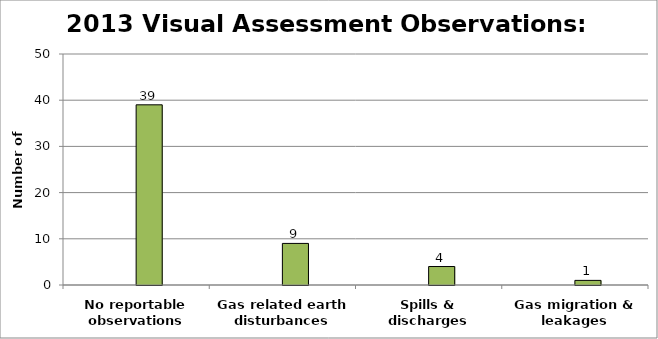
| Category | Series 0 | Series 1 | Series 2 | Series 3 |
|---|---|---|---|---|
| No reportable observations |  |  | 39 |  |
| Gas related earth disturbances |  |  | 9 |  |
| Spills & discharges |  |  | 4 |  |
| Gas migration & leakages |  |  | 1 |  |